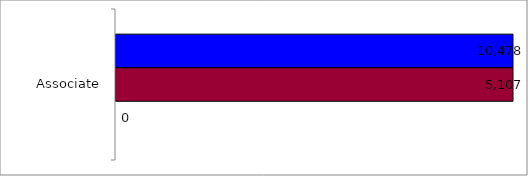
| Category | 50 states and D.C. | SREB states | State |
|---|---|---|---|
| Associate | 10478 | 5107 | 0 |